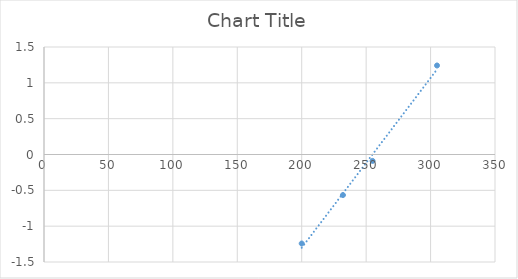
| Category | Series 0 |
|---|---|
| 200.0 | -1.242 |
| 232.0 | -0.566 |
| 255.0 | -0.09 |
| 305.0 | 1.242 |